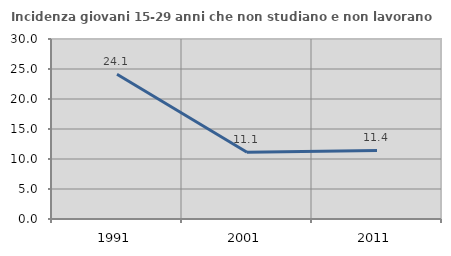
| Category | Incidenza giovani 15-29 anni che non studiano e non lavorano  |
|---|---|
| 1991.0 | 24.138 |
| 2001.0 | 11.111 |
| 2011.0 | 11.429 |